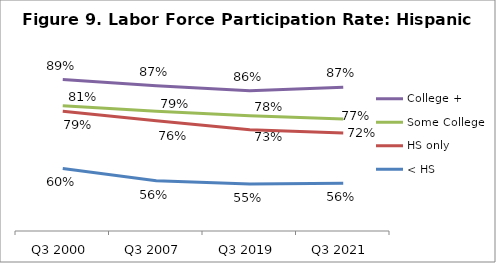
| Category | College + | Some College | HS only | < HS |
|---|---|---|---|---|
| Q3 2000 | 0.894 | 0.809 | 0.791 | 0.604 |
| Q3 2007 | 0.873 | 0.79 | 0.759 | 0.564 |
| Q3 2019 | 0.857 | 0.775 | 0.73 | 0.553 |
| Q3 2021 | 0.868 | 0.765 | 0.719 | 0.556 |